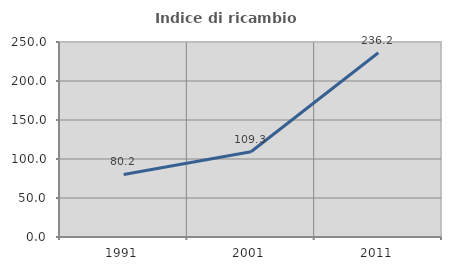
| Category | Indice di ricambio occupazionale  |
|---|---|
| 1991.0 | 80.224 |
| 2001.0 | 109.253 |
| 2011.0 | 236.19 |